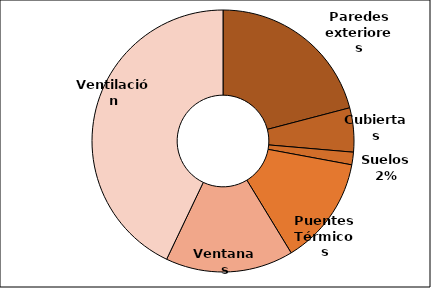
| Category | Perdidas Calefacción kWh/m2 año |
|---|---|
| Paredes exteriores | -18.346 |
| Cubiertas | -4.774 |
| Suelos | -1.361 |
| Puentes Térmicos | -11.729 |
| Solar ventanas | 0 |
| Ventanas | -13.845 |
| Fuentes Internas | 0 |
| Ventilación | -37.635 |